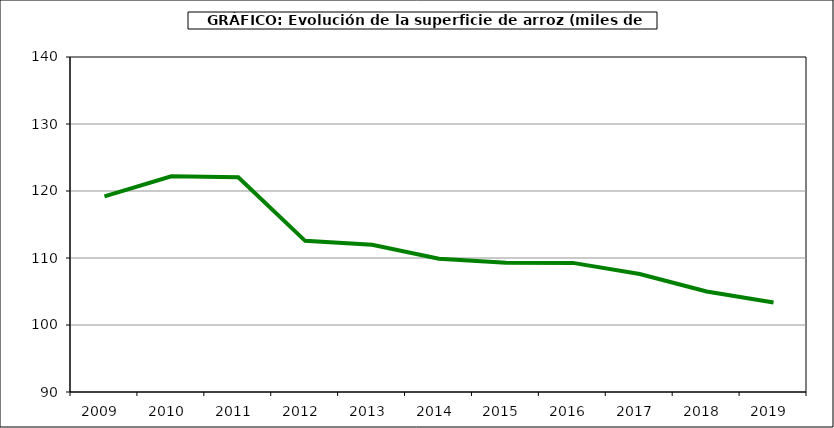
| Category | Superficie |
|---|---|
| 2009.0 | 119.202 |
| 2010.0 | 122.184 |
| 2011.0 | 122.058 |
| 2012.0 | 112.557 |
| 2013.0 | 111.984 |
| 2014.0 | 109.889 |
| 2015.0 | 109.29 |
| 2016.0 | 109.272 |
| 2017.0 | 107.604 |
| 2018.0 | 105.012 |
| 2019.0 | 103.367 |